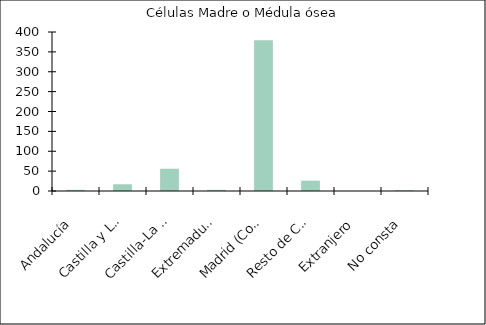
| Category | Células Madre o Médula ósea |
|---|---|
|    Andalucía | 3 |
|    Castilla y León | 17 |
|    Castilla-La Mancha | 56 |
|    Extremadura | 3 |
|    Madrid (Comunidad de) | 379 |
|    Resto de CCAA | 26 |
|    Extranjero | 0 |
|    No consta | 2 |